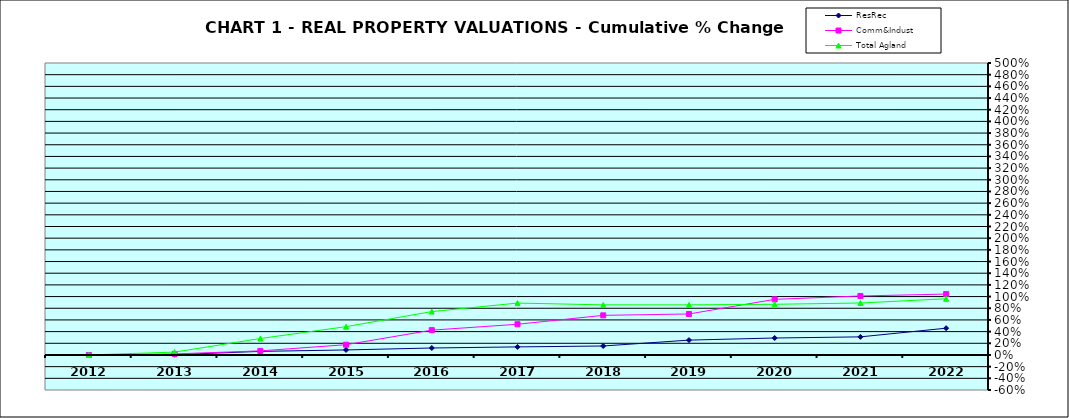
| Category | ResRec | Comm&Indust | Total Agland |
|---|---|---|---|
| 2012.0 | 0 | 0 | 0 |
| 2013.0 | 0.005 | 0.018 | 0.049 |
| 2014.0 | 0.061 | 0.07 | 0.281 |
| 2015.0 | 0.086 | 0.176 | 0.485 |
| 2016.0 | 0.119 | 0.425 | 0.743 |
| 2017.0 | 0.138 | 0.526 | 0.888 |
| 2018.0 | 0.154 | 0.679 | 0.858 |
| 2019.0 | 0.254 | 0.702 | 0.858 |
| 2020.0 | 0.29 | 0.952 | 0.868 |
| 2021.0 | 0.31 | 1.01 | 0.89 |
| 2022.0 | 0.458 | 1.043 | 0.963 |